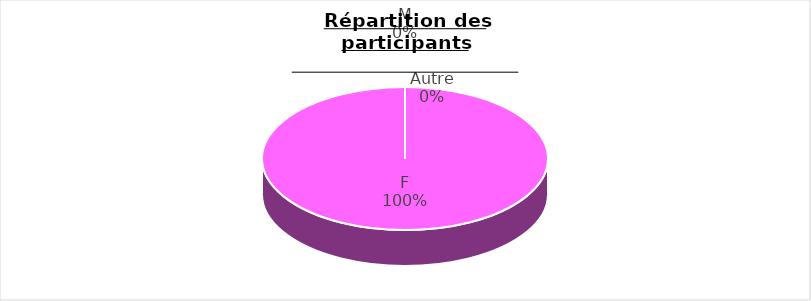
| Category | Series 0 |
|---|---|
| M | 0 |
| F | 11 |
| Autre | 0 |